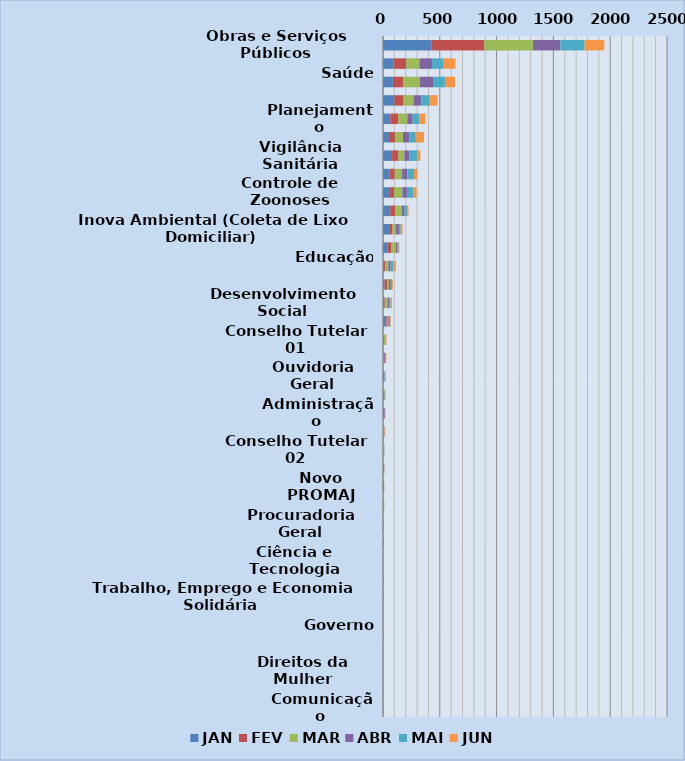
| Category | JAN | FEV | MAR | ABR | MAI | JUN |
|---|---|---|---|---|---|---|
| Obras e Serviços Públicos | 425 | 467 | 429 | 241 | 213 | 173 |
| Meio Ambiente | 93 | 113 | 114 | 111 | 98 | 109 |
| Saúde | 87 | 91 | 145 | 117 | 105 | 89 |
| Coordenadoria Animal (COPBEA) | 101 | 75 | 93 | 67 | 75 | 68 |
| Planejamento | 65 | 71 | 78 | 46 | 61 | 52 |
| Segurança Pública | 52 | 53 | 71 | 55 | 58 | 72 |
| Vigilância Sanitária | 80 | 57 | 51 | 45 | 68 | 29 |
| Fiscalização Fazendária (Posturas e Tributos) | 56 | 47 | 65 | 46 | 60 | 28 |
| Controle de Zoonoses | 54 | 44 | 73 | 40 | 55 | 30 |
| Defesa Civil | 64 | 45 | 56 | 25 | 21 | 14 |
| Inova Ambiental (Coleta de Lixo Domiciliar) | 54 | 30 | 27 | 29 | 16 | 16 |
| Agricultura | 42 | 33 | 37 | 16 | 9 | 7 |
| Educação | 9 | 10 | 29 | 19 | 25 | 21 |
| Viação Dedo de Deus | 14 | 22 | 17 | 15 | 12 | 7 |
| Desenvolvimento Social | 12 | 5 | 23 | 14 | 13 | 12 |
| Fazenda (ITBI, Dívida Ativa, Cálculo e Certidões, IPTU) | 25 | 9 | 13 | 6 | 9 | 5 |
| Conselho Tutelar 01 | 4 | 5 | 9 | 2 | 5 | 5 |
| Turismo | 5 | 2 | 3 | 10 | 5 | 5 |
| Ouvidoria Geral | 10 | 1 | 2 | 2 | 4 | 6 |
| Conselho Municipal de Defesa dos Direitos da Pessoa Idosa | 7 | 3 | 5 | 2 | 2 | 3 |
| Administração | 9 | 3 | 1 | 5 | 1 | 2 |
| Esportes e Lazer | 4 | 2 | 4 | 3 | 1 | 5 |
| Conselho Tutelar 02 | 1 | 1 | 4 | 4 | 2 | 1 |
| Fazenda (Espaço do Empreendedor) | 3 | 2 | 0 | 5 | 1 | 2 |
| Novo PROMAJ | 7 | 1 | 1 | 0 | 2 | 1 |
| Nota Terê | 1 | 0 | 3 | 4 | 2 | 1 |
| Procuradoria Geral | 2 | 0 | 0 | 1 | 5 | 0 |
| Projetos Especiais | 4 | 0 | 1 | 1 | 1 | 1 |
| Ciência e Tecnologia | 0 | 2 | 4 | 0 | 0 | 1 |
| Conselho Municipal dos Direitos da Criança e do Adolescente  (CMDCA) | 0 | 0 | 0 | 2 | 3 | 1 |
| Trabalho, Emprego e Economia Solidária | 2 | 3 | 1 | 0 | 0 | 0 |
| Cultura | 0 | 1 | 0 | 0 | 2 | 2 |
| Governo | 1 | 1 | 1 | 1 | 0 | 0 |
| Controle Interno | 0 | 0 | 0 | 0 | 0 | 3 |
| Direitos da Mulher | 1 | 0 | 2 | 0 | 0 | 0 |
| TEREPREV | 1 | 1 | 1 | 0 | 0 | 0 |
| Comunicação | 1 | 0 | 0 | 1 | 0 | 0 |